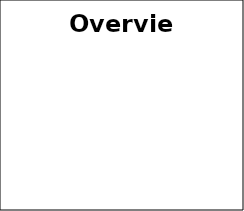
| Category | green yellow red |
|---|---|
| 0 | 0 |
| 1 | 0 |
| 2 | 0 |